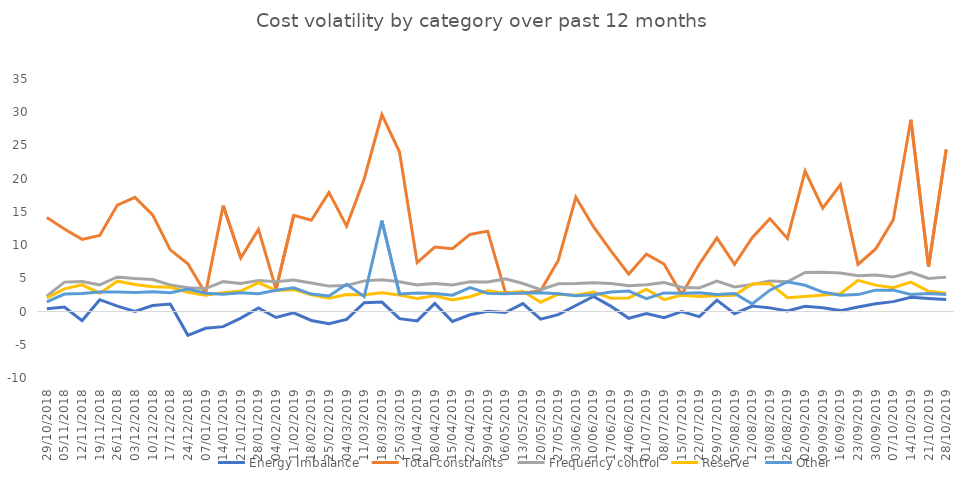
| Category | Energy Imbalance | Total constraints | Frequency control | Reserve | Other |
|---|---|---|---|---|---|
| 29/10/2018 | 0.405 | 14.173 | 2.323 | 2.041 | 1.47 |
| 05/11/2018 | 0.67 | 12.415 | 4.43 | 3.411 | 2.632 |
| 12/11/2018 | -1.388 | 10.865 | 4.507 | 4.012 | 2.709 |
| 19/11/2018 | 1.785 | 11.454 | 4.019 | 2.768 | 2.941 |
| 26/11/2018 | 0.823 | 16.026 | 5.214 | 4.575 | 2.931 |
| 03/12/2018 | 0.029 | 17.185 | 4.958 | 4.085 | 2.875 |
| 10/12/2018 | 0.917 | 14.545 | 4.812 | 3.744 | 2.988 |
| 17/12/2018 | 1.143 | 9.287 | 4.007 | 3.672 | 2.821 |
| 24/12/2018 | -3.57 | 7.192 | 3.6 | 2.913 | 3.397 |
| 07/01/2019 | -2.523 | 2.725 | 3.465 | 2.468 | 2.772 |
| 14/01/2019 | -2.271 | 15.948 | 4.503 | 2.848 | 2.612 |
| 21/01/2019 | -0.986 | 8.069 | 4.236 | 3.076 | 2.825 |
| 28/01/2019 | 0.548 | 12.368 | 4.671 | 4.362 | 2.687 |
| 04/02/2019 | -0.888 | 3.384 | 4.498 | 3.178 | 3.191 |
| 11/02/2019 | -0.205 | 14.489 | 4.751 | 3.299 | 3.563 |
| 18/02/2019 | -1.342 | 13.752 | 4.289 | 2.515 | 2.635 |
| 25/02/2019 | -1.843 | 17.932 | 3.829 | 1.998 | 2.336 |
| 04/03/2019 | -1.174 | 12.864 | 3.928 | 2.569 | 4.103 |
| 11/03/2019 | 1.325 | 19.999 | 4.619 | 2.513 | 2.247 |
| 18/03/2019 | 1.423 | 29.65 | 4.798 | 2.844 | 13.688 |
| 25/03/2019 | -1.072 | 24.004 | 4.487 | 2.484 | 2.658 |
| 01/04/2019 | -1.405 | 7.368 | 4.017 | 1.95 | 2.778 |
| 08/04/2019 | 1.228 | 9.712 | 4.207 | 2.391 | 2.705 |
| 15/04/2019 | -1.495 | 9.463 | 4.007 | 1.761 | 2.466 |
| 22/04/2019 | -0.491 | 11.609 | 4.467 | 2.223 | 3.613 |
| 29/04/2019 | 0.051 | 12.102 | 4.442 | 3.122 | 2.735 |
| 06/05/2019 | -0.142 | 2.903 | 4.914 | 2.748 | 2.662 |
| 13/05/2019 | 1.189 | 2.744 | 4.226 | 3.061 | 2.81 |
| 20/05/2019 | -1.146 | 3.116 | 3.288 | 1.404 | 2.818 |
| 27/05/2019 | -0.467 | 7.685 | 4.18 | 2.612 | 2.685 |
| 03/06/2019 | 0.907 | 17.198 | 4.227 | 2.445 | 2.392 |
| 10/06/2019 | 2.27 | 12.763 | 4.332 | 2.937 | 2.538 |
| 17/06/2019 | 0.778 | 9.09 | 4.207 | 1.987 | 2.933 |
| 24/06/2019 | -1.01 | 5.643 | 3.898 | 2.049 | 3.091 |
| 01/07/2019 | -0.309 | 8.651 | 4.027 | 3.355 | 1.928 |
| 08/07/2019 | -0.918 | 7.157 | 4.382 | 1.79 | 2.805 |
| 15/07/2019 | 0.013 | 2.561 | 3.651 | 2.467 | 2.768 |
| 22/07/2019 | -0.771 | 7.14 | 3.547 | 2.281 | 2.829 |
| 29/07/2019 | 1.713 | 11.07 | 4.58 | 2.373 | 2.565 |
| 05/08/2019 | -0.328 | 7.124 | 3.691 | 2.449 | 2.728 |
| 12/08/2019 | 0.817 | 11.128 | 4.076 | 4.132 | 1.16 |
| 19/08/2019 | 0.553 | 13.989 | 4.614 | 4.229 | 3.216 |
| 26/08/2019 | 0.096 | 11.006 | 4.471 | 2.078 | 4.493 |
| 02/09/2019 | 0.803 | 21.151 | 5.879 | 2.262 | 3.955 |
| 09/09/2019 | 0.561 | 15.555 | 5.897 | 2.503 | 2.938 |
| 16/09/2019 | 0.143 | 19.073 | 5.791 | 2.687 | 2.441 |
| 23/09/2019 | 0.69 | 7.098 | 5.384 | 4.694 | 2.55 |
| 30/09/2019 | 1.167 | 9.415 | 5.484 | 3.98 | 3.224 |
| 07/10/2019 | 1.496 | 13.812 | 5.218 | 3.588 | 3.224 |
| 14/10/2019 | 2.15 | 28.862 | 5.919 | 4.422 | 2.561 |
| 21/10/2019 | 1.952 | 6.731 | 4.98 | 3.051 | 2.725 |
| 28/10/2019 | 1.798 | 24.376 | 5.182 | 2.77 | 2.551 |